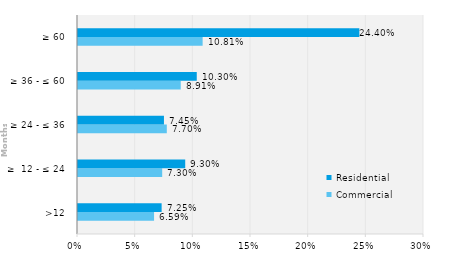
| Category | Commercial | Residential |
|---|---|---|
| >12 | 0.066 | 0.073 |
| ≥  12 - ≤ 24 | 0.073 | 0.093 |
| ≥ 24 - ≤ 36 | 0.077 | 0.075 |
| ≥ 36 - ≤ 60 | 0.089 | 0.103 |
| ≥ 60 | 0.108 | 0.244 |